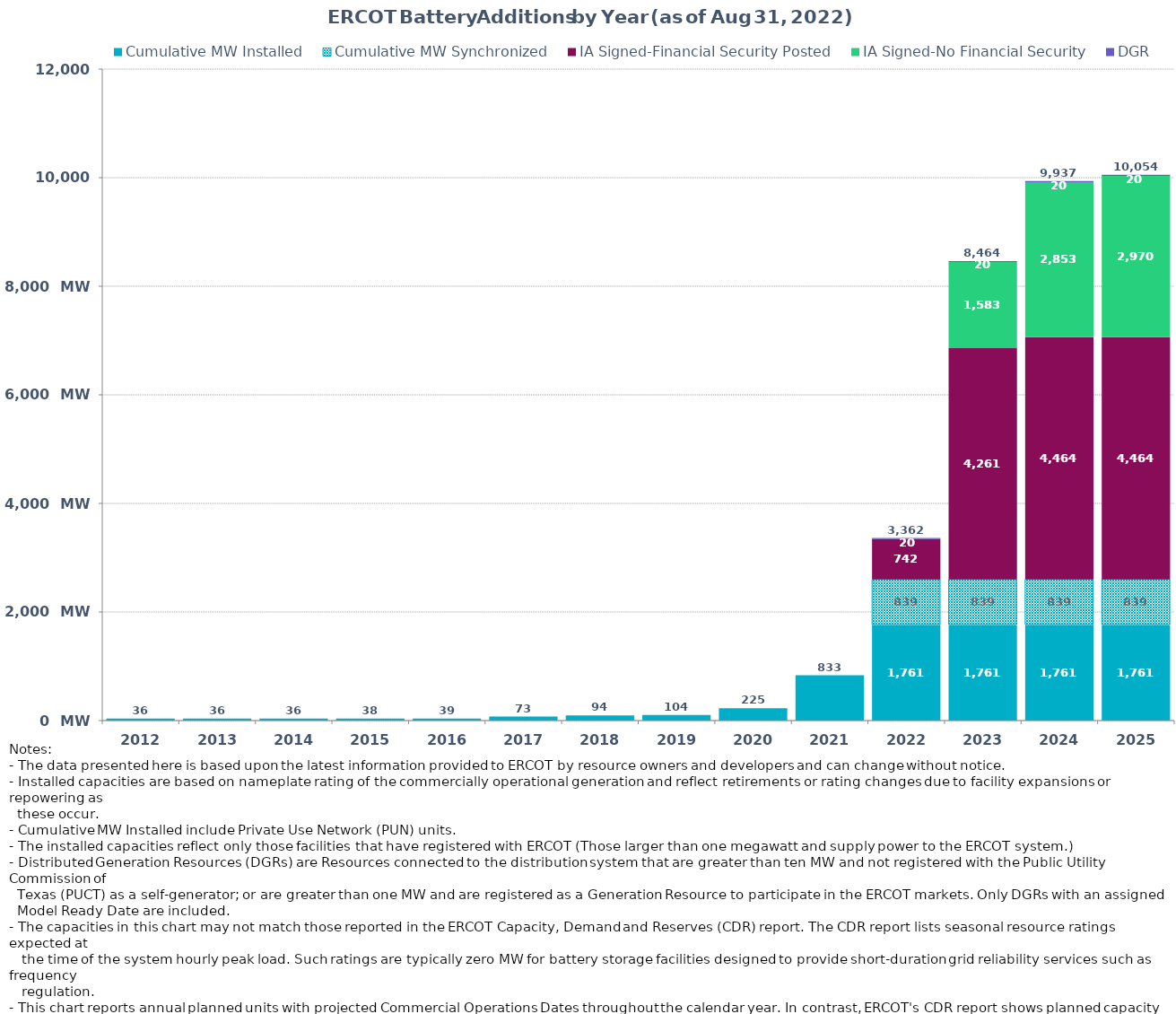
| Category | Cumulative MW Installed | Cumulative MW Synchronized | IA Signed-Financial Security Posted  | IA Signed-No Financial Security  | DGR | Cumulative Installed and Planned |
|---|---|---|---|---|---|---|
| 2012.0 | 36 | 0 | 0 | 0 | 0 | 36 |
| 2013.0 | 36 | 0 | 0 | 0 | 0 | 36 |
| 2014.0 | 36 | 0 | 0 | 0 | 0 | 36 |
| 2015.0 | 38 | 0 | 0 | 0 | 0 | 38 |
| 2016.0 | 39 | 0 | 0 | 0 | 0 | 39 |
| 2017.0 | 72.5 | 0 | 0 | 0 | 0 | 72.5 |
| 2018.0 | 93.8 | 0 | 0 | 0 | 0 | 93.8 |
| 2019.0 | 103.7 | 0 | 0 | 0 | 0 | 103.7 |
| 2020.0 | 225.4 | 0 | 0 | 0 | 0 | 225.4 |
| 2021.0 | 833.13 | 0 | 0 | 0 | 0 | 833.13 |
| 2022.0 | 1760.83 | 838.61 | 742.28 | 0 | 19.9 | 3361.62 |
| 2023.0 | 1760.83 | 838.61 | 4261.35 | 1583.48 | 19.9 | 8464.17 |
| 2024.0 | 1760.83 | 838.61 | 4463.95 | 2853.46 | 19.9 | 9936.75 |
| 2025.0 | 1760.83 | 838.61 | 4463.95 | 2970.36 | 19.9 | 10053.65 |